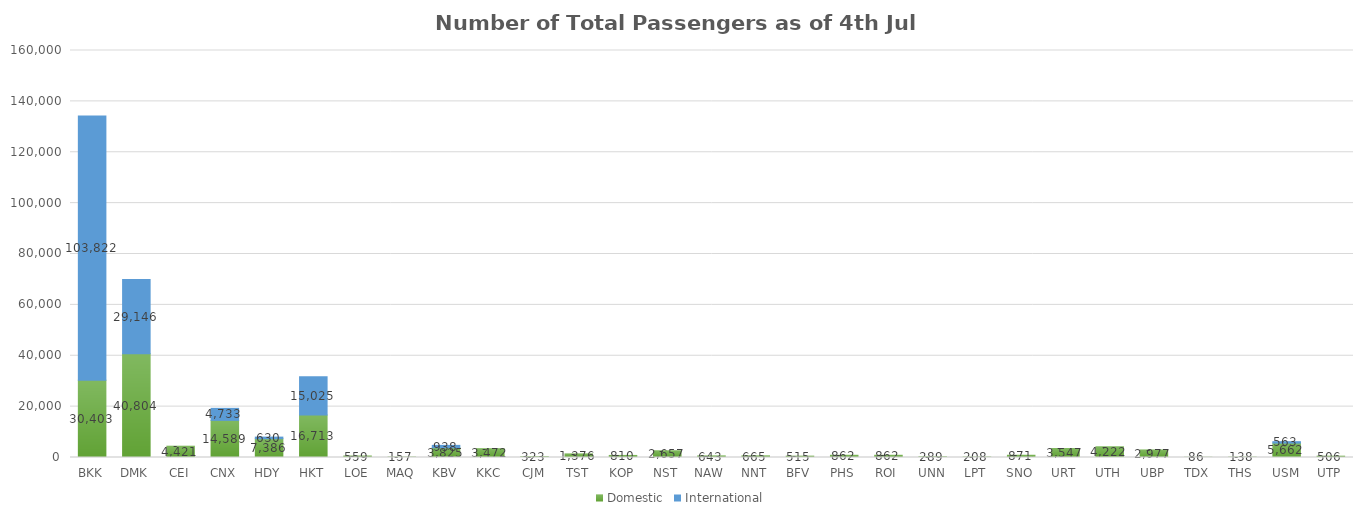
| Category | Domestic | International |
|---|---|---|
| BKK | 30403 | 103822 |
| DMK | 40804 | 29146 |
| CEI | 4421 | 0 |
| CNX | 14589 | 4733 |
| HDY | 7386 | 630 |
| HKT | 16713 | 15025 |
| LOE | 559 | 0 |
| MAQ | 157 | 0 |
| KBV | 3825 | 938 |
| KKC | 3472 | 0 |
| CJM | 323 | 0 |
| TST | 1376 | 0 |
| KOP | 810 | 0 |
| NST | 2657 | 0 |
| NAW | 643 | 0 |
| NNT | 665 | 0 |
| BFV | 515 | 0 |
| PHS | 862 | 0 |
| ROI | 862 | 0 |
| UNN | 289 | 0 |
| LPT | 208 | 0 |
| SNO | 871 | 0 |
| URT | 3547 | 0 |
| UTH | 4222 | 0 |
| UBP | 2977 | 0 |
| TDX | 86 | 0 |
| THS | 138 | 0 |
| USM | 5662 | 563 |
| UTP | 506 | 0 |